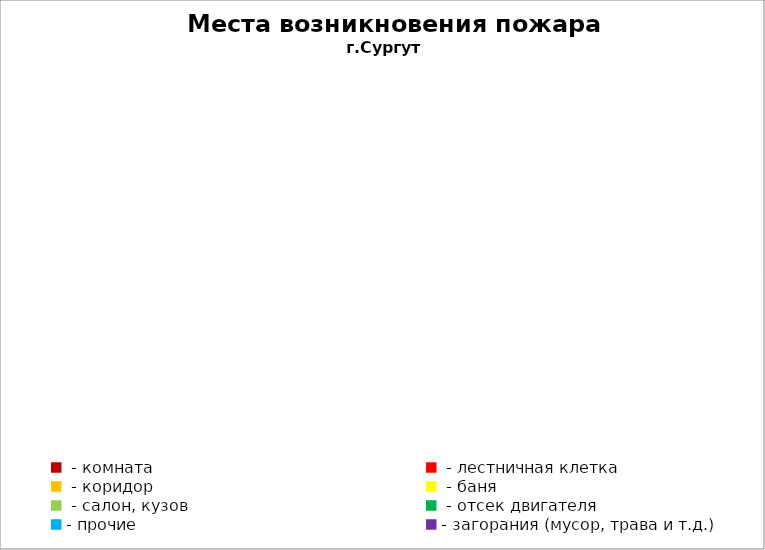
| Category | Места возникновения пожара |
|---|---|
|  - комната | 12 |
|  - лестничная клетка | 5 |
|  - коридор | 3 |
|  - баня | 7 |
|  - салон, кузов | 2 |
|  - отсек двигателя | 5 |
| - прочие | 11 |
| - загорания (мусор, трава и т.д.)  | 17 |